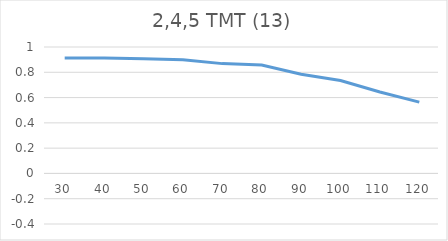
| Category | Series 0 |
|---|---|
| 30.0 | 0.913 |
| 40.0 | 0.913 |
| 50.0 | 0.906 |
| 60.0 | 0.898 |
| 70.0 | 0.869 |
| 80.0 | 0.857 |
| 90.0 | 0.784 |
| 100.0 | 0.735 |
| 110.0 | 0.644 |
| 120.0 | 0.564 |